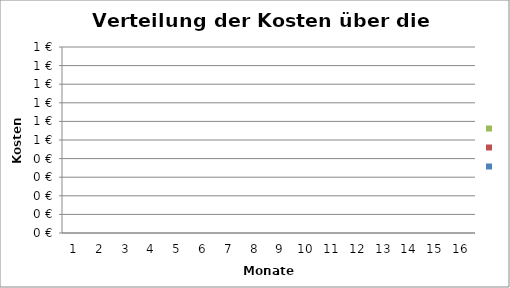
| Category | Series 3 | Series 2 | Series 1 |
|---|---|---|---|
| 0 | 0 | 0 | 0 |
| 1 | 0 | 0 | 0 |
| 2 | 0 | 0 | 0 |
| 3 | 0 | 0 | 0 |
| 4 | 0 | 0 | 0 |
| 5 | 0 | 0 | 0 |
| 6 | 0 | 0 | 0 |
| 7 | 0 | 0 | 0 |
| 8 | 0 | 0 | 0 |
| 9 | 0 | 0 | 0 |
| 10 | 0 | 0 | 0 |
| 11 | 0 | 0 | 0 |
| 12 | 0 | 0 | 0 |
| 13 | 0 | 0 | 0 |
| 14 | 0 | 0 | 0 |
| 15 | 0 | 0 | 0 |